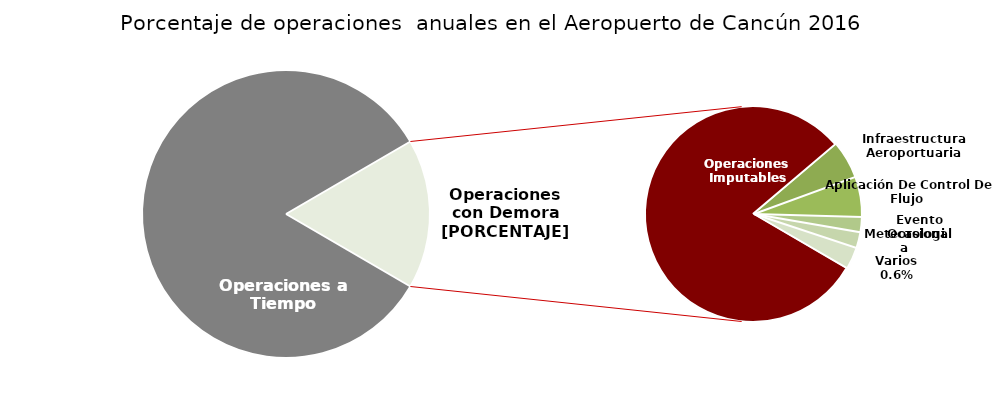
| Category | Series 0 |
|---|---|
| Operaciones a Tiempo | 57993 |
| Operaciones Imputables | 9412 |
| Infraestructura Aeroportuaria | 657 |
| Aplicación De Control De Flujo  | 706 |
| Evento Ocasional | 266 |
| Meteorologia | 278 |
| Varios | 387 |